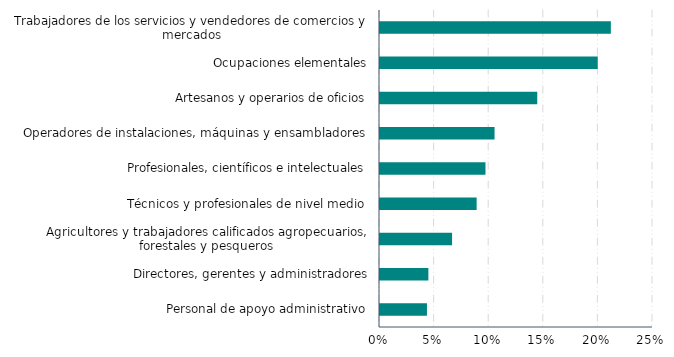
| Category | Series 0 |
|---|---|
| Personal de apoyo administrativo | 0.043 |
| Directores, gerentes y administradores | 0.044 |
| Agricultores y trabajadores calificados agropecuarios, forestales y pesqueros | 0.066 |
| Técnicos y profesionales de nivel medio | 0.088 |
| Profesionales, científicos e intelectuales | 0.097 |
| Operadores de instalaciones, máquinas y ensambladores | 0.105 |
| Artesanos y operarios de oficios | 0.144 |
| Ocupaciones elementales | 0.199 |
| Trabajadores de los servicios y vendedores de comercios y mercados | 0.211 |